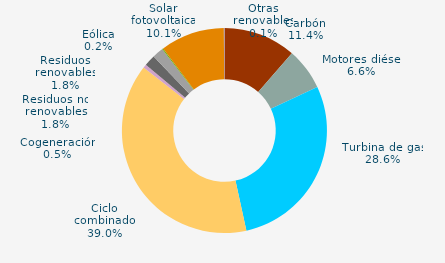
| Category | Series 0 |
|---|---|
| Carbón | 11.419 |
| Motores diésel | 6.6 |
| Turbina de gas | 28.553 |
| Ciclo combinado | 38.959 |
| Generación auxiliar | 0 |
| Cogeneración | 0.546 |
| Residuos no renovables | 1.771 |
| Residuos renovables | 1.771 |
| Eólica | 0.171 |
| Solar fotovoltaica | 10.111 |
| Otras renovables | 0.101 |